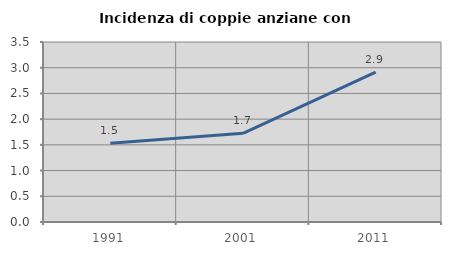
| Category | Incidenza di coppie anziane con figli |
|---|---|
| 1991.0 | 1.531 |
| 2001.0 | 1.724 |
| 2011.0 | 2.914 |